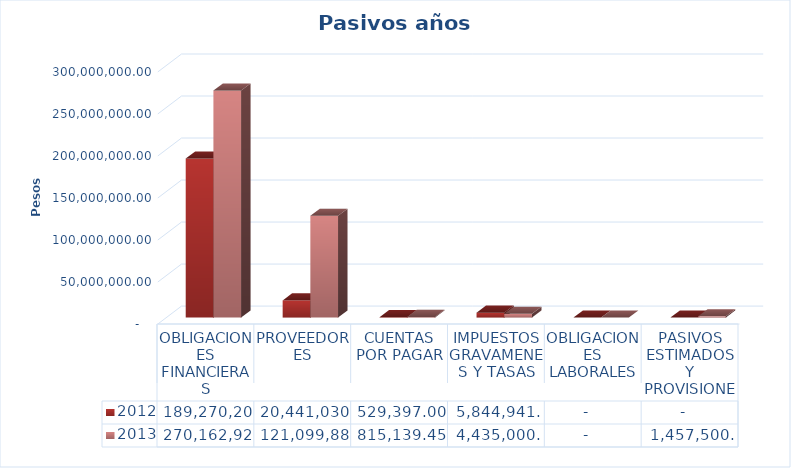
| Category | 2012 | 2013 |
|---|---|---|
| OBLIGACIONES FINANCIERAS | 189270201 | 270162921.25 |
| PROVEEDORES | 20441030 | 121099882.45 |
| CUENTAS POR PAGAR | 529397 | 815139.45 |
| IMPUESTOS GRAVAMENES Y TASAS | 5844941 | 4435000 |
| OBLIGACIONES LABORALES | 0 | 0 |
| PASIVOS ESTIMADOS Y PROVISIONE | 0 | 1457500 |